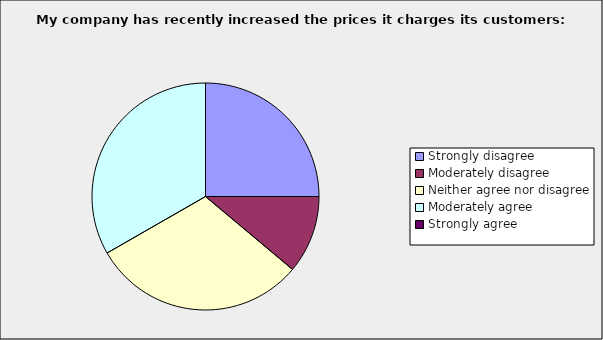
| Category | Series 0 |
|---|---|
| Strongly disagree | 0.25 |
| Moderately disagree | 0.111 |
| Neither agree nor disagree | 0.306 |
| Moderately agree | 0.333 |
| Strongly agree | 0 |